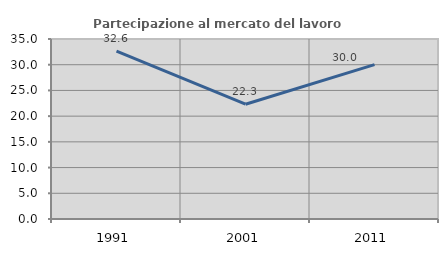
| Category | Partecipazione al mercato del lavoro  femminile |
|---|---|
| 1991.0 | 32.639 |
| 2001.0 | 22.318 |
| 2011.0 | 30.018 |